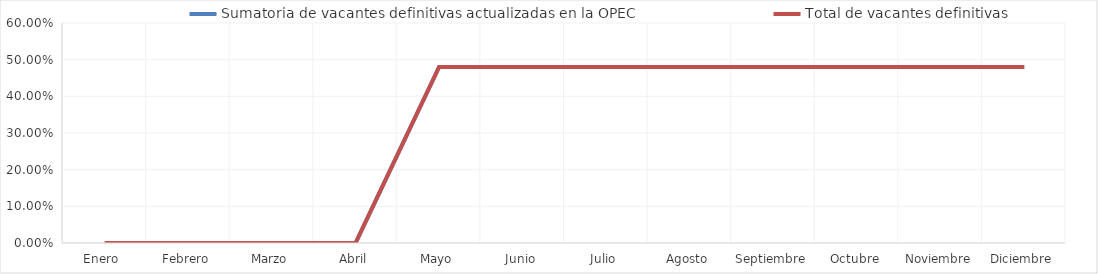
| Category | Sumatoria de vacantes definitivas actualizadas en la OPEC | Total de vacantes definitivas |
|---|---|---|
| Enero  | 0 | 0 |
| Febrero | 0 | 0 |
| Marzo | 0 | 0 |
| Abril | 0 | 0 |
| Mayo | 0.48 | 0.48 |
| Junio | 0.48 | 0.48 |
| Julio | 0.48 | 0.48 |
| Agosto | 0.48 | 0.48 |
| Septiembre | 0.48 | 0.48 |
| Octubre | 0.48 | 0.48 |
| Noviembre | 0.48 | 0.48 |
| Diciembre | 0.48 | 0.48 |